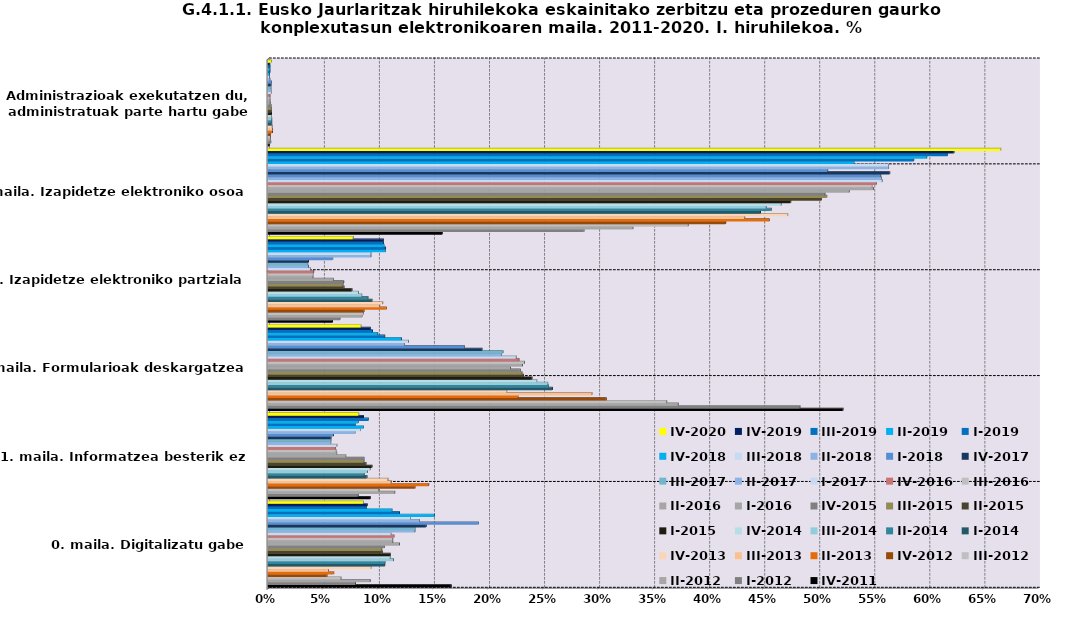
| Category | IV-2011 | I-2012 | II-2012 | III-2012 | IV-2012 | II-2013 | III-2013 | IV-2013 | I-2014 | II-2014 | III-2014 | IV-2014 | I-2015 | II-2015 | III-2015 | IV-2015 | I-2016 | II-2016 | III-2016 | IV-2016 | I-2017 | II-2017 | III-2017 | IV-2017 | I-2018 | II-2018 | III-2018 | IV-2018 | I-2019 | II-2019 | III-2019 | IV-2019 | IV-2020 |
|---|---|---|---|---|---|---|---|---|---|---|---|---|---|---|---|---|---|---|---|---|---|---|---|---|---|---|---|---|---|---|---|---|---|
|  0. maila. Digitalizatu gabe | 0.166 | 0.079 | 0.093 | 0.066 | 0.054 | 0.06 | 0.055 | 0.094 | 0.106 | 0.106 | 0.114 | 0.111 | 0.111 | 0.104 | 0.103 | 0.106 | 0.119 | 0.113 | 0.113 | 0.115 | 0.112 | 0.134 | 0.134 | 0.144 | 0.191 | 0.138 | 0.13 | 0.151 | 0.12 | 0.113 | 0.09 | 0.09 | 0.087 |
| 1. maila. Informatzea besterik ez | 0.093 | 0.082 | 0.115 | 0.101 | 0.134 | 0.146 | 0.112 | 0.109 | 0.09 | 0.087 | 0.09 | 0.093 | 0.095 | 0.089 | 0.087 | 0.087 | 0.071 | 0.063 | 0.062 | 0.061 | 0.063 | 0.057 | 0.057 | 0.057 | 0.06 | 0.079 | 0.084 | 0.087 | 0.079 | 0.082 | 0.091 | 0.087 | 0.083 |
| 2. maila. Formularioak deskargatzea | 0.522 | 0.483 | 0.373 | 0.362 | 0.307 | 0.227 | 0.294 | 0.217 | 0.258 | 0.255 | 0.254 | 0.244 | 0.24 | 0.232 | 0.231 | 0.229 | 0.22 | 0.231 | 0.233 | 0.228 | 0.226 | 0.212 | 0.213 | 0.194 | 0.179 | 0.124 | 0.128 | 0.121 | 0.106 | 0.1 | 0.095 | 0.093 | 0.085 |
| 3. maila. Izapidetze elektroniko partziala | 0.059 | 0.065 | 0.086 | 0.087 | 0.087 | 0.108 | 0.102 | 0.104 | 0.094 | 0.091 | 0.085 | 0.082 | 0.076 | 0.069 | 0.068 | 0.069 | 0.059 | 0.041 | 0.041 | 0.042 | 0.039 | 0.037 | 0.036 | 0.037 | 0.059 | 0.094 | 0.094 | 0.107 | 0.107 | 0.106 | 0.105 | 0.105 | 0.077 |
| 4. maila. Izapidetze elektroniko osoa | 0.158 | 0.287 | 0.332 | 0.382 | 0.416 | 0.455 | 0.433 | 0.472 | 0.447 | 0.457 | 0.453 | 0.466 | 0.475 | 0.503 | 0.508 | 0.506 | 0.528 | 0.55 | 0.549 | 0.553 | 0.558 | 0.557 | 0.557 | 0.565 | 0.509 | 0.564 | 0.564 | 0.532 | 0.587 | 0.598 | 0.617 | 0.623 | 0.666 |
| 5. maila. Administrazioak exekutatzen du, administratuak parte hartu gabe | 0.001 | 0.003 | 0.002 | 0.002 | 0.002 | 0.004 | 0.004 | 0.004 | 0.004 | 0.003 | 0.003 | 0.003 | 0.003 | 0.003 | 0.003 | 0.003 | 0.002 | 0.002 | 0.002 | 0.002 | 0.003 | 0.003 | 0.003 | 0.003 | 0.003 | 0.002 | 0.001 | 0.001 | 0.002 | 0.002 | 0.002 | 0.002 | 0.003 |